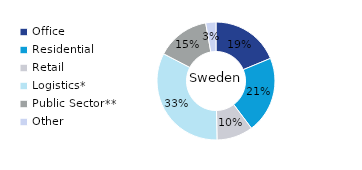
| Category | Sweden |
|---|---|
| Office | 0.187 |
| Residential | 0.21 |
| Retail | 0.1 |
| Logistics* | 0.329 |
| Public Sector** | 0.146 |
| Other | 0.028 |